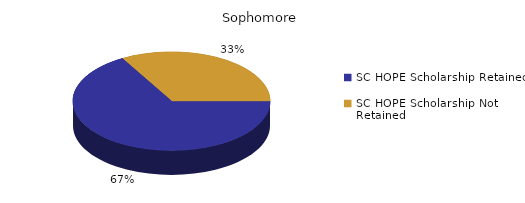
| Category | Sophomore |
|---|---|
| SC HOPE Scholarship Retained  | 2 |
| SC HOPE Scholarship Not Retained  | 1 |